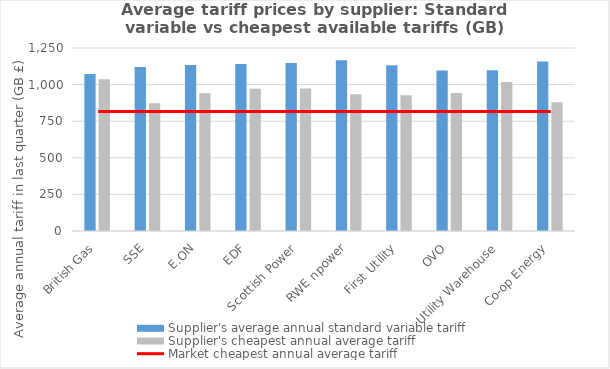
| Category | Supplier's average annual standard variable tariff | Supplier's cheapest annual average tariff |
|---|---|---|
| British Gas | 1072 | 1036.285 |
| SSE | 1120.669 | 872 |
| E.ON | 1133.151 | 940.974 |
| EDF | 1141.503 | 971.378 |
| Scottish Power | 1147.266 | 973.039 |
| RWE npower | 1165.882 | 934.792 |
| First Utility | 1131.771 | 927.419 |
| OVO | 1096.849 | 942.025 |
| Utility Warehouse | 1097.976 | 1017.253 |
| Co-op Energy | 1157.597 | 879.909 |